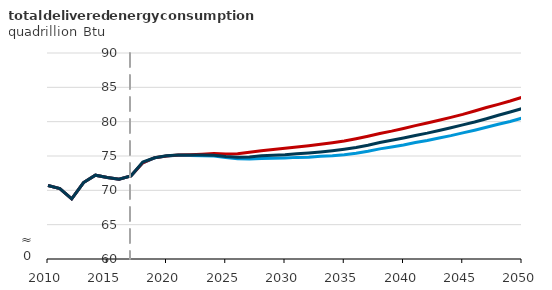
| Category | New efficiency requirements | No new efficiency requirements | Reference |
|---|---|---|---|
| 2010.0 | 70.706 | 70.706 | 70.706 |
| 2011.0 | 70.246 | 70.246 | 70.246 |
| 2012.0 | 68.76 | 68.76 | 68.76 |
| 2013.0 | 71.127 | 71.127 | 71.127 |
| 2014.0 | 72.204 | 72.204 | 72.204 |
| 2015.0 | 71.875 | 71.875 | 71.875 |
| 2016.0 | 71.627 | 71.627 | 71.628 |
| 2017.0 | 72.105 | 72.105 | 72.105 |
| 2018.0 | 74.006 | 74.018 | 74.128 |
| 2019.0 | 74.73 | 74.75 | 74.736 |
| 2020.0 | 74.987 | 75.012 | 75.041 |
| 2021.0 | 75.092 | 75.134 | 75.146 |
| 2022.0 | 75.082 | 75.19 | 75.136 |
| 2023.0 | 75.051 | 75.272 | 75.155 |
| 2024.0 | 74.999 | 75.362 | 75.114 |
| 2025.0 | 74.783 | 75.3 | 74.934 |
| 2026.0 | 74.586 | 75.324 | 74.804 |
| 2027.0 | 74.58 | 75.542 | 74.872 |
| 2028.0 | 74.639 | 75.774 | 75.022 |
| 2029.0 | 74.681 | 75.957 | 75.097 |
| 2030.0 | 74.723 | 76.133 | 75.184 |
| 2031.0 | 74.8 | 76.307 | 75.336 |
| 2032.0 | 74.836 | 76.486 | 75.442 |
| 2033.0 | 74.959 | 76.698 | 75.585 |
| 2034.0 | 75.043 | 76.939 | 75.765 |
| 2035.0 | 75.197 | 77.176 | 75.982 |
| 2036.0 | 75.4 | 77.506 | 76.23 |
| 2037.0 | 75.69 | 77.874 | 76.562 |
| 2038.0 | 76.036 | 78.281 | 76.957 |
| 2039.0 | 76.312 | 78.626 | 77.28 |
| 2040.0 | 76.613 | 79.011 | 77.62 |
| 2041.0 | 76.962 | 79.418 | 77.994 |
| 2042.0 | 77.267 | 79.793 | 78.328 |
| 2043.0 | 77.628 | 80.198 | 78.717 |
| 2044.0 | 77.971 | 80.624 | 79.116 |
| 2045.0 | 78.371 | 81.062 | 79.534 |
| 2046.0 | 78.759 | 81.553 | 79.955 |
| 2047.0 | 79.178 | 82.058 | 80.432 |
| 2048.0 | 79.612 | 82.523 | 80.926 |
| 2049.0 | 80.026 | 83.009 | 81.4 |
| 2050.0 | 80.517 | 83.541 | 81.907 |